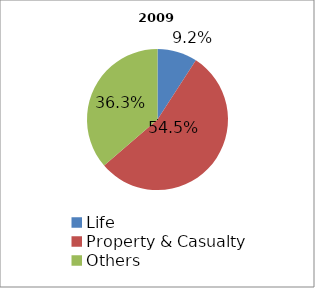
| Category | 2009 |
|---|---|
| Life | 100140228 |
| Property & Casualty | 595595528 |
| Others | 396896101 |